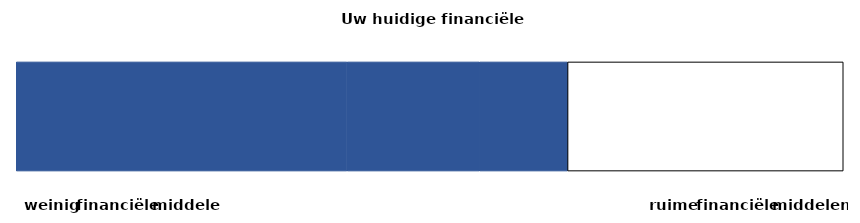
| Category | roerend vermogen | onroerend vermogen | netto-inkomen | spaarmogelijkheid | maximale score |
|---|---|---|---|---|---|
| 0 | 0.357 | 0.143 | 0.095 | 0 | 0.298 |